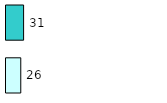
| Category | Series 0 | Series 1 |
|---|---|---|
| 0 | 26 | 31 |